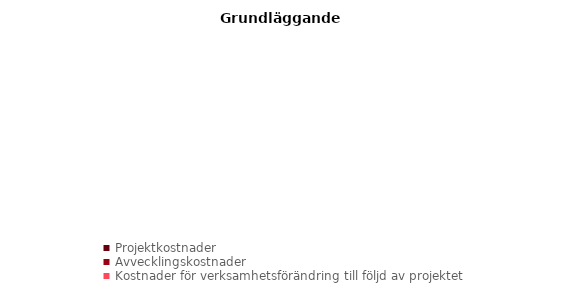
| Category | Ack |
|---|---|
| Projektkostnader | 0 |
| Avvecklingskostnader | 0 |
| Kostnader för verksamhetsförändring till följd av projektet | 0 |